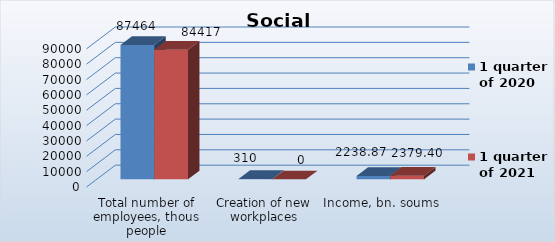
| Category | 1 quarter of 2020 | 1 quarter of 2021 |
|---|---|---|
| Total number of employees, thous people | 87464 | 84417 |
| Creation of new workplaces | 310 | 0 |
| Income, bn. soums | 2238.872 | 2379.4 |